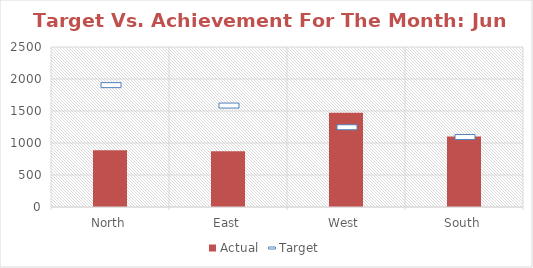
| Category | Actual |
|---|---|
| North | 886 |
| East | 870 |
| West | 1473 |
| South | 1100 |